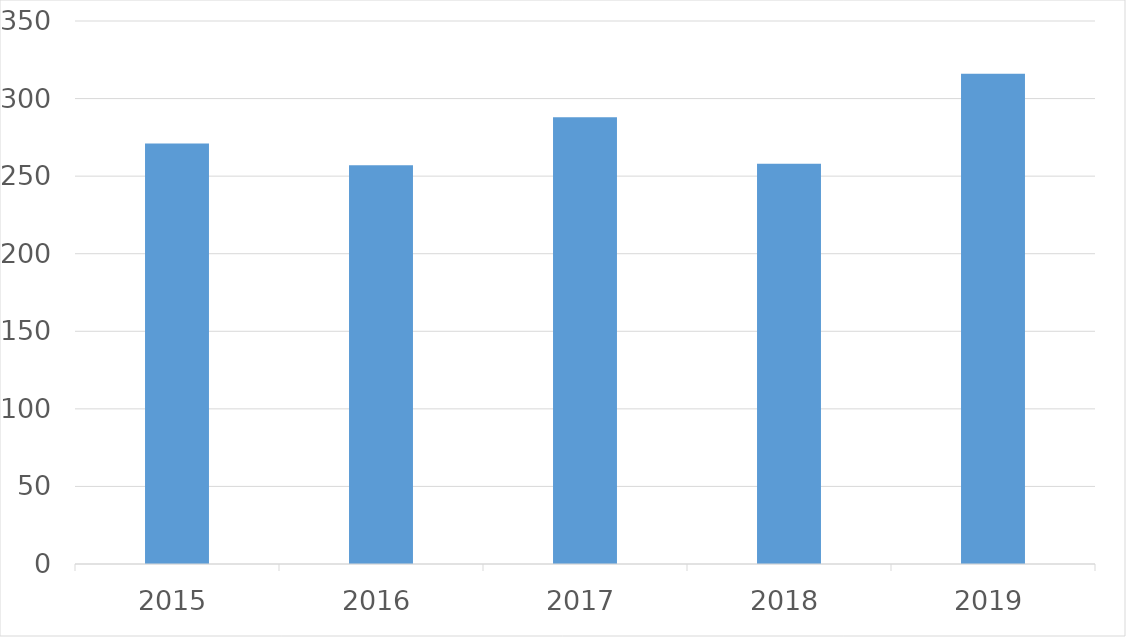
| Category | Series 0 |
|---|---|
| 2015 | 271 |
| 2016 | 257 |
| 2017 | 288 |
| 2018 | 258 |
| 2019 | 316 |